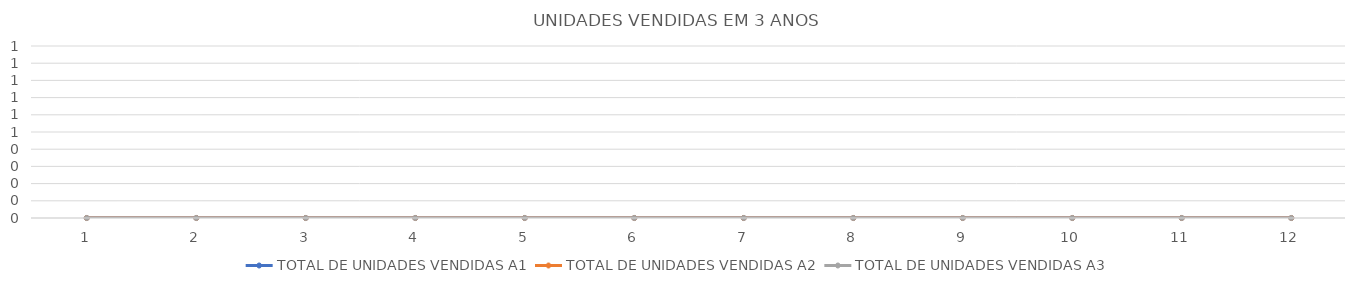
| Category | TOTAL DE UNIDADES VENDIDAS A1 | TOTAL DE UNIDADES VENDIDAS A2 | TOTAL DE UNIDADES VENDIDAS A3 |
|---|---|---|---|
| 0 | 0 | 0 | 0 |
| 1 | 0 | 0 | 0 |
| 2 | 0 | 0 | 0 |
| 3 | 0 | 0 | 0 |
| 4 | 0 | 0 | 0 |
| 5 | 0 | 0 | 0 |
| 6 | 0 | 0 | 0 |
| 7 | 0 | 0 | 0 |
| 8 | 0 | 0 | 0 |
| 9 | 0 | 0 | 0 |
| 10 | 0 | 0 | 0 |
| 11 | 0 | 0 | 0 |